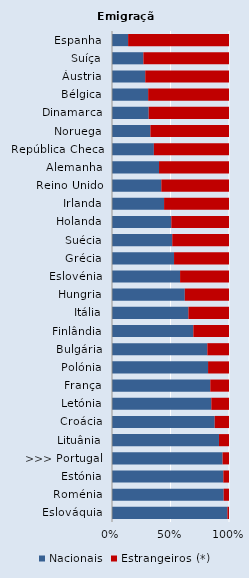
| Category | Nacionais | Estrangeiros (*) |
|---|---|---|
| Espanha | 13.776 | 86.224 |
| Suíça | 26.827 | 73.173 |
| Áustria | 28.422 | 71.578 |
| Bélgica | 30.912 | 69.088 |
| Dinamarca | 31.337 | 68.663 |
| Noruega | 32.847 | 67.153 |
| República Checa | 35.788 | 64.212 |
| Alemanha | 40.198 | 59.802 |
| Reino Unido | 42.146 | 57.854 |
| Irlanda | 44.517 | 55.483 |
| Holanda | 50.69 | 49.31 |
| Suécia | 51.488 | 48.512 |
| Grécia | 53.025 | 46.975 |
| Eslovénia | 58.196 | 41.804 |
| Hungria | 62.206 | 37.794 |
| Itália | 65.292 | 34.708 |
| Finlândia | 69.517 | 30.483 |
| Bulgária | 81.492 | 18.508 |
| Polónia | 82.102 | 17.898 |
| França | 84 | 16 |
| Letónia | 84.881 | 15.119 |
| Croácia | 87.76 | 12.24 |
| Lituânia | 91.432 | 8.568 |
| >>> Portugal | 94.513 | 5.487 |
| Estónia | 95.163 | 4.837 |
| Roménia | 95.437 | 4.563 |
| Eslováquia | 98.628 | 1.372 |